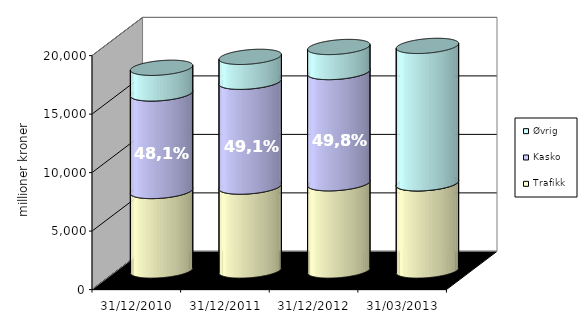
| Category | Trafikk | Kasko | Øvrig |
|---|---|---|---|
| 31/12/2010 | 6795.7 | 8339.721 | 2191.06 |
| 31/12/2011 | 7171.76 | 8962.957 | 2126.121 |
| 31/12/2012 | 7457.552 | 9507.808 | 2139.625 |
| 31/03/2013 | 7454.016 | 0 | 11745.269 |